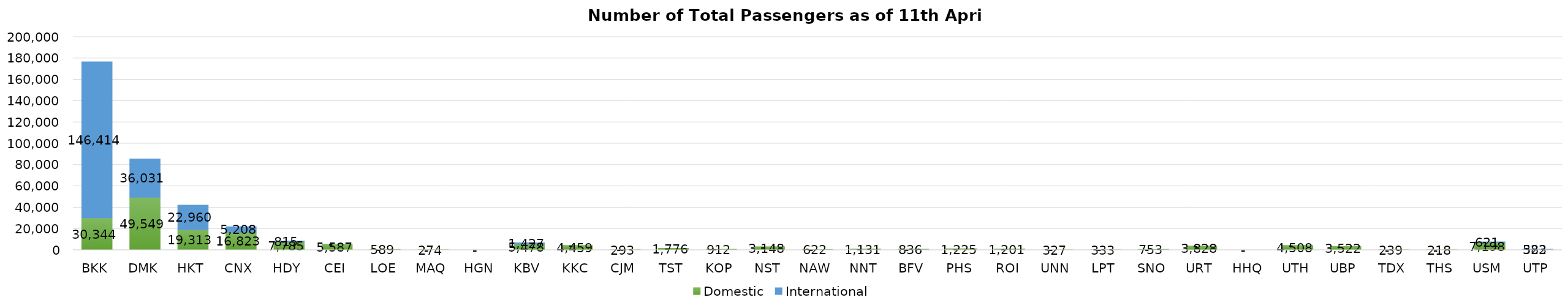
| Category | Domestic | International |
|---|---|---|
| BKK | 30344 | 146414 |
| DMK | 49549 | 36031 |
| HKT | 19313 | 22960 |
| CNX | 16823 | 5208 |
| HDY | 7785 | 815 |
| CEI | 5587 | 0 |
| LOE | 589 | 0 |
| MAQ | 274 | 0 |
| HGN | 0 | 0 |
| KBV | 5478 | 1427 |
| KKC | 4459 | 0 |
| CJM | 293 | 0 |
| TST | 1776 | 0 |
| KOP | 912 | 0 |
| NST | 3148 | 0 |
| NAW | 622 | 0 |
| NNT | 1131 | 0 |
| BFV | 836 | 0 |
| PHS | 1225 | 0 |
| ROI | 1201 | 0 |
| UNN | 327 | 0 |
| LPT | 333 | 0 |
| SNO | 753 | 0 |
| URT | 3828 | 0 |
| HHQ | 0 | 0 |
| UTH | 4508 | 0 |
| UBP | 3522 | 0 |
| TDX | 239 | 0 |
| THS | 218 | 0 |
| USM | 7198 | 621 |
| UTP | 582 | 323 |